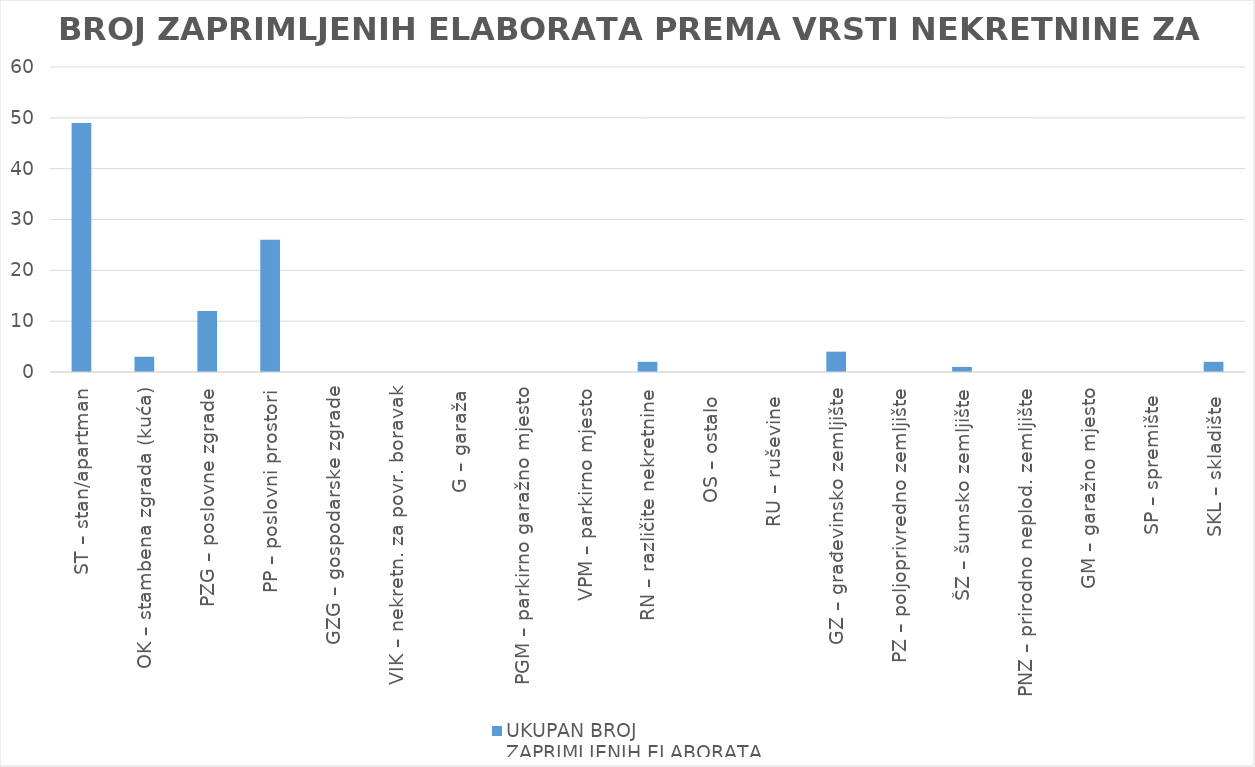
| Category | UKUPAN BROJ 
ZAPRIMLJENIH ELABORATA |
|---|---|
| ST – stan/apartman | 49 |
| OK – stambena zgrada (kuća) | 3 |
| PZG – poslovne zgrade | 12 |
| PP – poslovni prostori | 26 |
| GZG – gospodarske zgrade | 0 |
| VIK – nekretn. za povr. boravak | 0 |
| G – garaža | 0 |
| PGM – parkirno garažno mjesto | 0 |
| VPM – parkirno mjesto | 0 |
| RN – različite nekretnine | 2 |
| OS – ostalo  | 0 |
| RU – ruševine  | 0 |
| GZ – građevinsko zemljište | 4 |
| PZ – poljoprivredno zemljište | 0 |
| ŠZ – šumsko zemljište | 1 |
| PNZ – prirodno neplod. zemljište | 0 |
| GM – garažno mjesto | 0 |
| SP – spremište  | 0 |
| SKL – skladište  | 2 |